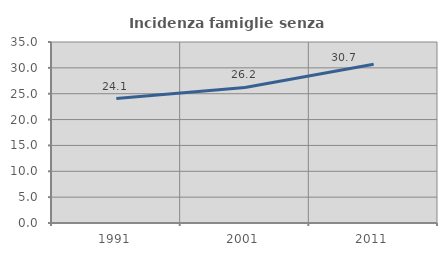
| Category | Incidenza famiglie senza nuclei |
|---|---|
| 1991.0 | 24.061 |
| 2001.0 | 26.203 |
| 2011.0 | 30.688 |